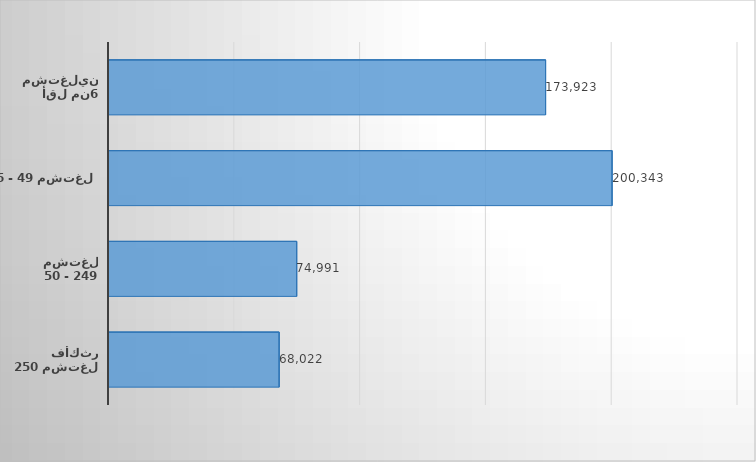
| Category | Series 0 |
|---|---|
| أقل من6 مشتغلين | 173923 |
| 6 - 49 مشتغل | 200343 |
| 50 - 249 مشتغل | 74991 |
| 250 مشتغل فأكثر | 68022 |